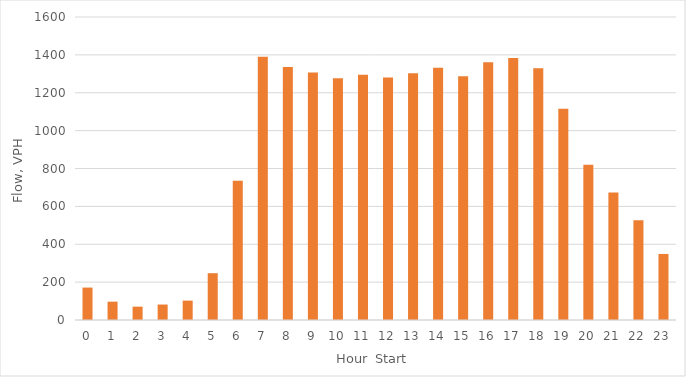
| Category | Series 1 |
|---|---|
| 0.0 | 171.2 |
| 1.0 | 96.8 |
| 2.0 | 70.4 |
| 3.0 | 81.6 |
| 4.0 | 102.4 |
| 5.0 | 247.2 |
| 6.0 | 735.2 |
| 7.0 | 1390.4 |
| 8.0 | 1336 |
| 9.0 | 1306.4 |
| 10.0 | 1276 |
| 11.0 | 1295.2 |
| 12.0 | 1280 |
| 13.0 | 1303.2 |
| 14.0 | 1332 |
| 15.0 | 1287.2 |
| 16.0 | 1361.6 |
| 17.0 | 1384 |
| 18.0 | 1329.6 |
| 19.0 | 1115.2 |
| 20.0 | 819.2 |
| 21.0 | 672.8 |
| 22.0 | 526.4 |
| 23.0 | 348.8 |